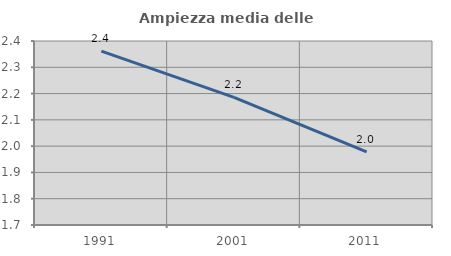
| Category | Ampiezza media delle famiglie |
|---|---|
| 1991.0 | 2.362 |
| 2001.0 | 2.185 |
| 2011.0 | 1.978 |